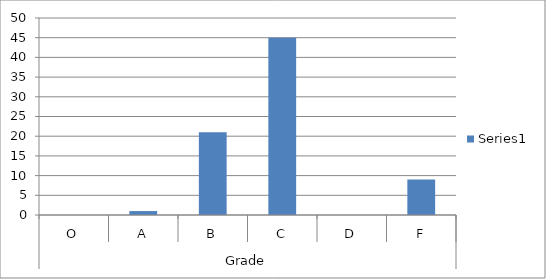
| Category | Series 0 |
|---|---|
| 0 | 0 |
| 1 | 1 |
| 2 | 21 |
| 3 | 45 |
| 4 | 0 |
| 5 | 9 |